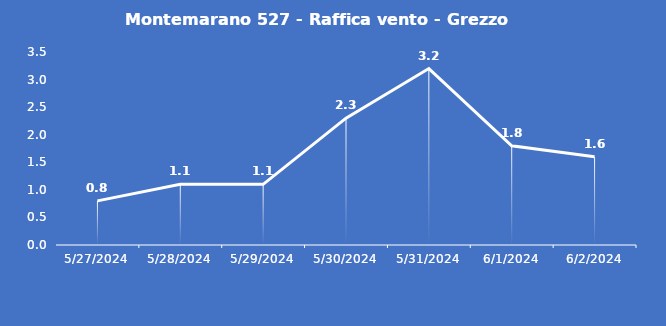
| Category | Montemarano 527 - Raffica vento - Grezzo (m/s) |
|---|---|
| 5/27/24 | 0.8 |
| 5/28/24 | 1.1 |
| 5/29/24 | 1.1 |
| 5/30/24 | 2.3 |
| 5/31/24 | 3.2 |
| 6/1/24 | 1.8 |
| 6/2/24 | 1.6 |